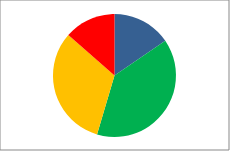
| Category | Series 1 |
|---|---|
| Outstanding | 32 |
| Good | 81 |
| RI | 66 |
| Inadequate | 28 |